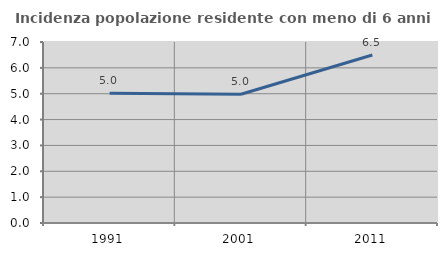
| Category | Incidenza popolazione residente con meno di 6 anni |
|---|---|
| 1991.0 | 5.016 |
| 2001.0 | 4.98 |
| 2011.0 | 6.496 |